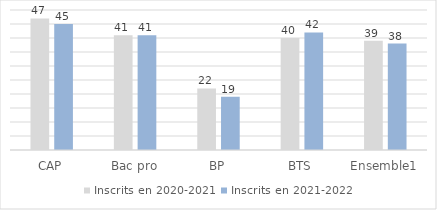
| Category | Inscrits en 2020-2021 | Inscrits en 2021-2022 |
|---|---|---|
| CAP | 47 | 45 |
| Bac pro | 41 | 41 |
| BP | 22 | 19 |
| BTS | 40 | 42 |
| Ensemble1 | 39 | 38 |